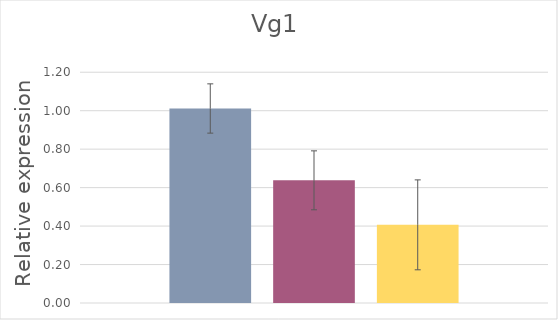
| Category | Carb For | Pro For | Nur  |
|---|---|---|---|
| 0 | 1.011 | 0.638 | 0.406 |